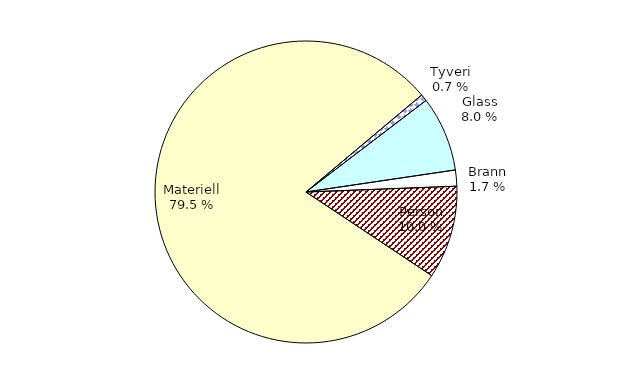
| Category | Series 0 |
|---|---|
| Tyveri | 32.126 |
| Glass | 349.285 |
| Brann | 74.844 |
| Person | 432.634 |
| Materiell | 3457.692 |